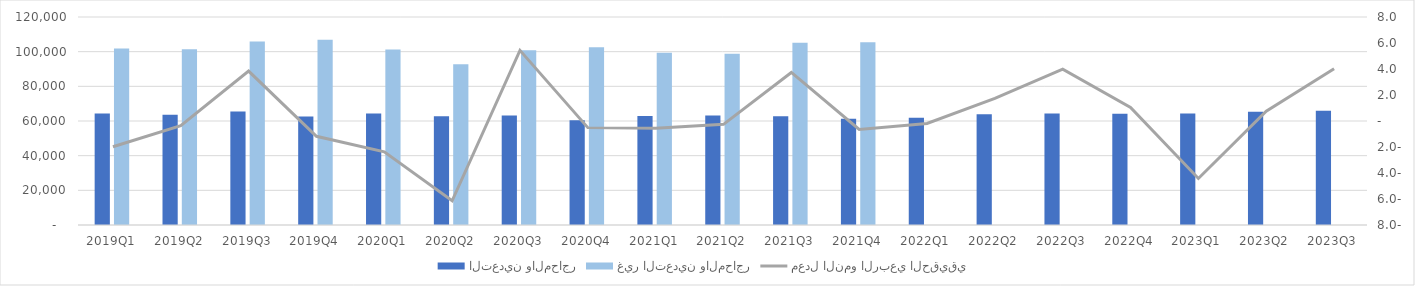
| Category | التعدين والمحاجر | غير التعدين والمحاجر |
|---|---|---|
| 2019Q1 | 64257.943 | 101849.24 |
| 2019Q2 | 63561.402 | 101463.551 |
| 2019Q3 | 65518.443 | 105892.021 |
| 2019Q4 | 62542.582 | 106846.953 |
| 2020Q1 | 64320.963 | 101294.014 |
| 2020Q2 | 62733.036 | 92719.682 |
| 2020Q3 | 63151.036 | 100746.478 |
| 2020Q4 | 60455.968 | 102606.272 |
| 2021Q1 | 62865.616 | 99317.218 |
| 2021Q2 | 63146.084 | 98778.533 |
| 2021Q3 | 62684.76 | 105097.088 |
| 2021Q4 | 61253.478 | 105427.085 |
| 2022Q1 | 61856.089 | 0 |
| 2022Q2 | 63883.502 | 0 |
| 2022Q3 | 64369.866 | 0 |
| 2022Q4 | 64179.829 | 0 |
| 2023Q1 | 64369.48 | 0 |
| 2023Q2 | 65374.42 | 0 |
| 2023Q3 | 65876.187 | 0 |